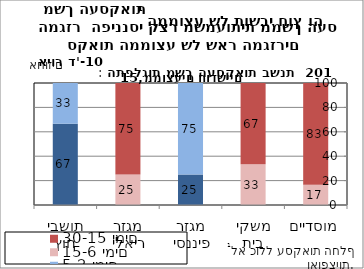
| Category | 2-0 ימים | 5-2 ימים | 15-6 ימים | 30-15 ימים |
|---|---|---|---|---|
| מוסדיים | 0 | 0 | 16.667 | 83.333 |
| משקי בית | 0 | 0 | 33.333 | 66.667 |
| מגזר פיננסי | 25 | 75 | 0 | 0 |
| מגזר ריאלי | 0 | 0 | 25 | 75 |
| תושבי חוץ | 66.667 | 33.333 | 0 | 0 |